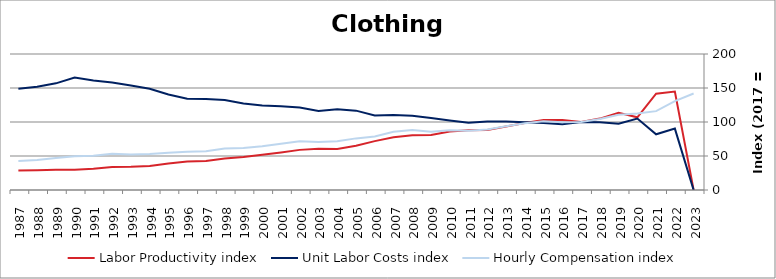
| Category | Labor Productivity index | Unit Labor Costs index | Hourly Compensation index |
|---|---|---|---|
| 2023.0 | 0 | 0 | 141.862 |
| 2022.0 | 144.772 | 90.302 | 130.732 |
| 2021.0 | 141.64 | 81.869 | 115.959 |
| 2020.0 | 106.929 | 105.09 | 112.372 |
| 2019.0 | 113.718 | 97.359 | 110.715 |
| 2018.0 | 105.007 | 99.485 | 104.466 |
| 2017.0 | 100 | 100 | 100 |
| 2016.0 | 102.885 | 96.766 | 99.558 |
| 2015.0 | 102.878 | 98.441 | 101.274 |
| 2014.0 | 98.598 | 99.493 | 98.099 |
| 2013.0 | 93.307 | 100.588 | 93.856 |
| 2012.0 | 88.279 | 100.848 | 89.027 |
| 2011.0 | 87.929 | 98.939 | 86.996 |
| 2010.0 | 86.085 | 102.074 | 87.871 |
| 2009.0 | 80.837 | 105.79 | 85.517 |
| 2008.0 | 80.633 | 109.288 | 88.122 |
| 2007.0 | 77.688 | 110.353 | 85.731 |
| 2006.0 | 71.854 | 109.607 | 78.758 |
| 2005.0 | 65.034 | 116.717 | 75.906 |
| 2004.0 | 60.472 | 118.587 | 71.712 |
| 2003.0 | 60.717 | 116.191 | 70.548 |
| 2002.0 | 59.006 | 121.212 | 71.523 |
| 2001.0 | 55.257 | 123.323 | 68.144 |
| 2000.0 | 51.78 | 124.261 | 64.342 |
| 1999.0 | 48.389 | 127.371 | 61.633 |
| 1998.0 | 46.212 | 132.234 | 61.108 |
| 1997.0 | 42.616 | 133.976 | 57.095 |
| 1996.0 | 41.948 | 134.277 | 56.326 |
| 1995.0 | 39.112 | 140.451 | 54.933 |
| 1994.0 | 35.441 | 148.999 | 52.806 |
| 1993.0 | 34.022 | 153.807 | 52.328 |
| 1992.0 | 33.777 | 158.023 | 53.376 |
| 1991.0 | 31.197 | 160.988 | 50.223 |
| 1990.0 | 29.907 | 165.501 | 49.497 |
| 1989.0 | 29.959 | 156.852 | 46.991 |
| 1988.0 | 29.12 | 151.986 | 44.259 |
| 1987.0 | 28.727 | 149.06 | 42.82 |